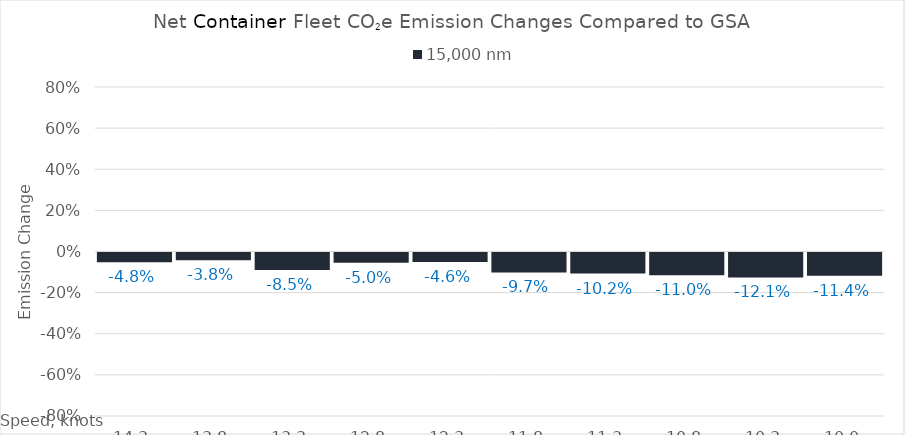
| Category | 15,000 |
|---|---|
| 14.3 | -0.048 |
| 13.8 | -0.038 |
| 13.3 | -0.085 |
| 12.8 | -0.05 |
| 12.3 | -0.046 |
| 11.8 | -0.097 |
| 11.3 | -0.102 |
| 10.8 | -0.11 |
| 10.3 | -0.121 |
| 10.0 | -0.114 |